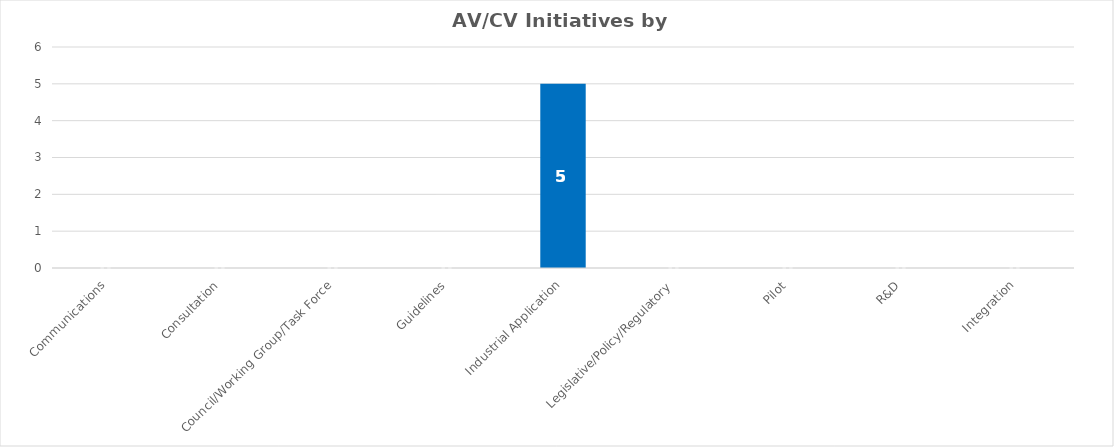
| Category | Series 0 |
|---|---|
| Communications | 0 |
| Consultation | 0 |
| Council/Working Group/Task Force | 0 |
| Guidelines | 0 |
| Industrial Application | 5 |
| Legislative/Policy/Regulatory | 0 |
| Pilot | 0 |
| R&D | 0 |
| Integration | 0 |